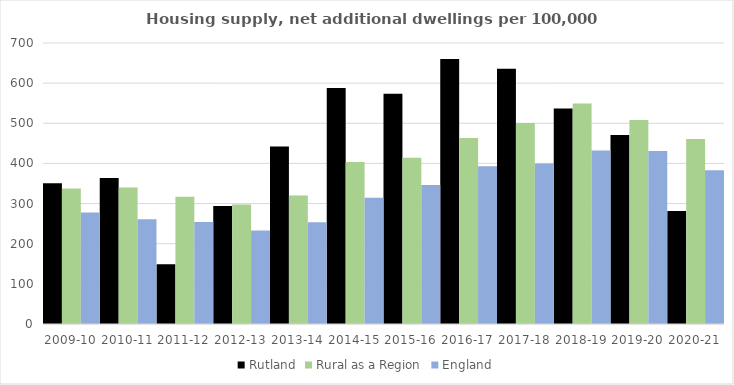
| Category | Rutland | Rural as a Region | England |
|---|---|---|---|
| 2009-10 | 350.375 | 337.852 | 277.548 |
| 2010-11 | 363.95 | 340.105 | 260.994 |
| 2011-12 | 149.011 | 317.04 | 254.007 |
| 2012-13 | 293.832 | 297.763 | 233.153 |
| 2013-14 | 441.904 | 319.835 | 253.602 |
| 2014-15 | 588.035 | 403.796 | 314.256 |
| 2015-16 | 573.634 | 414.091 | 346.154 |
| 2016-17 | 659.837 | 463.209 | 393.256 |
| 2017-18 | 635.862 | 500.68 | 399.646 |
| 2018-19 | 536.564 | 549.491 | 432.099 |
| 2019-20 | 470.859 | 508.493 | 431.187 |
| 2020-21 | 281.648 | 461.114 | 382.827 |